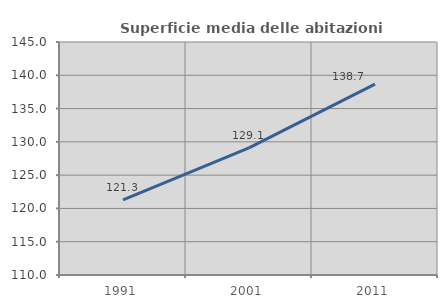
| Category | Superficie media delle abitazioni occupate |
|---|---|
| 1991.0 | 121.287 |
| 2001.0 | 129.086 |
| 2011.0 | 138.684 |